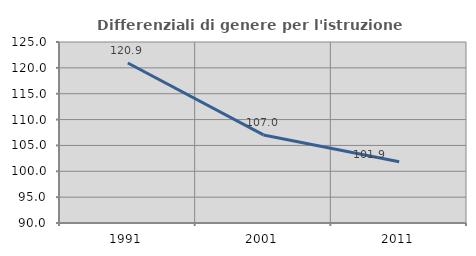
| Category | Differenziali di genere per l'istruzione superiore |
|---|---|
| 1991.0 | 120.943 |
| 2001.0 | 107.031 |
| 2011.0 | 101.856 |